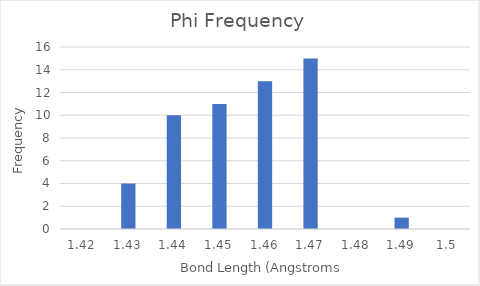
| Category | Phi |
|---|---|
| 1.42 | 0 |
| 1.43 | 4 |
| 1.44 | 10 |
| 1.45 | 11 |
| 1.46 | 13 |
| 1.47 | 15 |
| 1.48 | 0 |
| 1.49 | 1 |
| 1.5 | 0 |